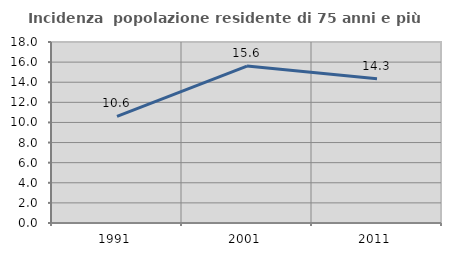
| Category | Incidenza  popolazione residente di 75 anni e più |
|---|---|
| 1991.0 | 10.607 |
| 2001.0 | 15.61 |
| 2011.0 | 14.34 |